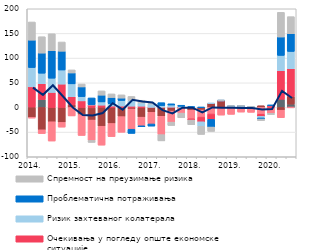
| Category | Други фактори | Трошкови извора за кредите | Конкуренција осталих банака | Очекивања у погледу опште економске ситуације | Ризик захтеваног колатерала | Проблематична потраживања | Спремност на преузимање ризика |
|---|---|---|---|---|---|---|---|
| 2014. | 0.8 | -19.9 | -1.7 | 41 | 39.1 | 55.5 | 36.9 |
|  | 16.1 | -45.3 | -7.7 | 31.9 | 21.4 | 40.8 | 33.2 |
|  | 0 | -29 | -39.1 | 30.4 | 28.9 | 55.7 | 34.4 |
|  | 0 | -30.3 | -9.6 | 47.3 | 28.6 | 38.1 | 18.7 |
| 2015. | 0 | 5.3 | -17.2 | 16.4 | 26.1 | 22.1 | 6.2 |
|  | 0 | -14.5 | -42.3 | 13.3 | 8.7 | 19.6 | 6 |
|  | -0.9 | -24.7 | -41.2 | 5.2 | 0.6 | 13.5 | -4.1 |
|  | 0.5 | -38.1 | -38.3 | 4.2 | 6.5 | 13.7 | 8.7 |
| 2016. | 0 | -32.5 | -26.6 | 2.8 | 4.8 | 12.6 | 7.3 |
|  | 0 | -18.6 | -31.7 | 2.8 | 11.4 | 4.8 | 6.6 |
|  | 0 | -3.2 | -40.9 | 2.6 | 11.7 | -8.5 | 8 |
|  | 0 | -19.7 | -17.5 | 2.6 | 6.4 | -2 | 5.6 |
| 2017. | 0 | -9.9 | -23.6 | 0.3 | 6.6 | -4.3 | 1.9 |
|  | 0 | -17.9 | -37.2 | 0.4 | 3.4 | 5.9 | -12.7 |
|  | 0 | -7.4 | -22.4 | 0.6 | 4.3 | 2.5 | -6.8 |
|  | 0 | -2.2 | -9.3 | 0.1 | 2.2 | 2.2 | -9.5 |
| 2018. | 0 | -5.5 | -17.5 | -2.5 | 0 | 1.9 | -9.6 |
|  | 0 | -5.2 | -14.4 | -9.5 | -9.1 | 0.3 | -16.5 |
|  | 0 | 8.2 | -13.3 | -10.8 | 0.3 | -15.6 | -8.9 |
|  | 0 | 13.5 | -15.5 | 0.1 | 0.3 | 0.3 | 0.1 |
| 2019. | 0 | 0 | -14 | 0.1 | 2.4 | 0.3 | 0.1 |
|  | 0 | 2.3 | -9.4 | 0.1 | 0.3 | 0.3 | 0.1 |
|  | 0 | 0 | -9.9 | 0.1 | 0.4 | 0.4 | 0.1 |
|  | 0 | 3.5 | -13.7 | -4.4 | -3.2 | -2.2 | -3.4 |
| 2020. | 0 | 0 | -11.9 | 3.7 | 0.4 | 0.4 | -2.6 |